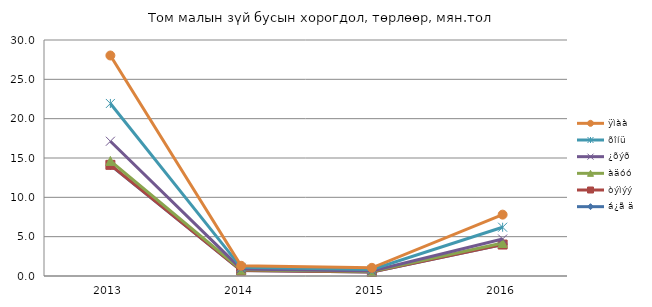
| Category | á¿ã ä | òýìýý | àäóó | ¿õýð | õîíü | ÿìàà |
|---|---|---|---|---|---|---|
| 2013.0 | 14.1 | 0.03 | 0.5 | 2.5 | 4.8 | 6.1 |
| 2014.0 | 0.7 | 0 | 0.1 | 0.1 | 0.2 | 0.2 |
| 2015.0 | 0.5 | 0.02 | 0.05 | 0.07 | 0.2 | 0.2 |
| 2016.0 | 4 | 0 | 0.2 | 0.5 | 1.5 | 1.6 |